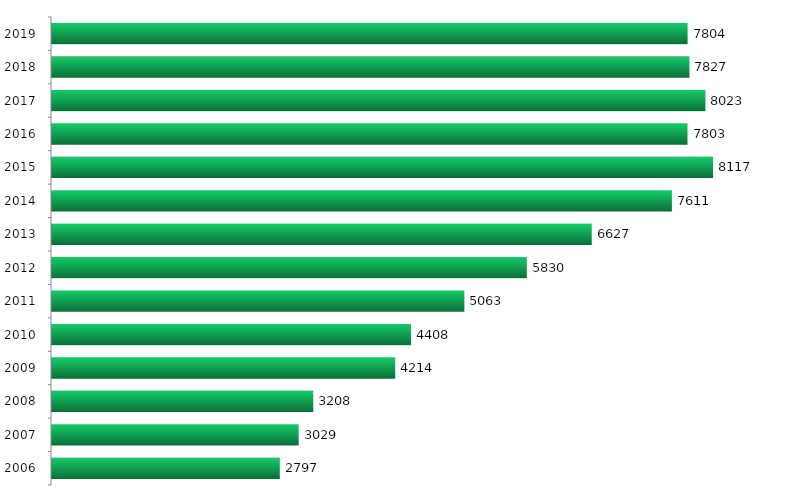
| Category | Series 0 |
|---|---|
| 2006.0 | 2797 |
| 2007.0 | 3029 |
| 2008.0 | 3208 |
| 2009.0 | 4214 |
| 2010.0 | 4408 |
| 2011.0 | 5063 |
| 2012.0 | 5830 |
| 2013.0 | 6627 |
| 2014.0 | 7611 |
| 2015.0 | 8117 |
| 2016.0 | 7803 |
| 2017.0 | 8023 |
| 2018.0 | 7827 |
| 2019.0 | 7804 |